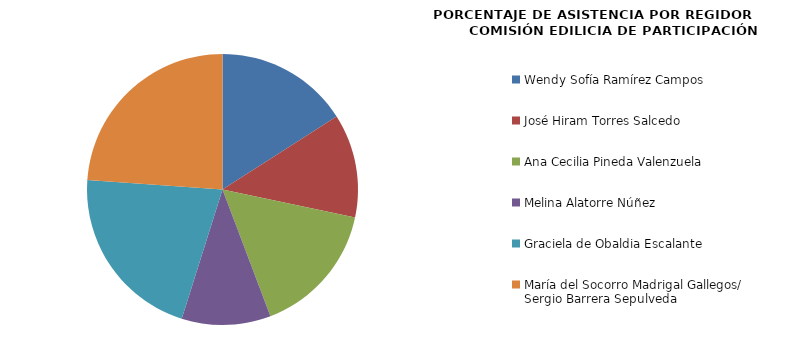
| Category | Series 0 |
|---|---|
| Wendy Sofía Ramírez Campos | 100 |
| José Hiram Torres Salcedo | 77.778 |
| Ana Cecilia Pineda Valenzuela | 100 |
| Melina Alatorre Núñez | 66.667 |
| Graciela de Obaldia Escalante | 133.333 |
| María del Socorro Madrigal Gallegos/
Sergio Barrera Sepulveda | 150 |